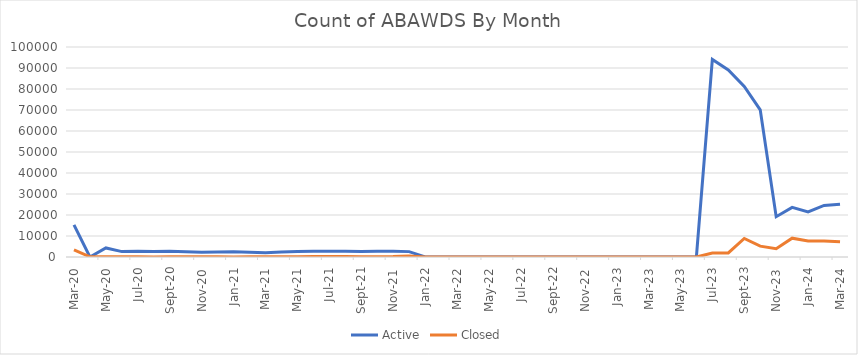
| Category | Active | Closed |
|---|---|---|
| 2024-03-24 | 25155 | 7256 |
| 2024-02-24 | 24536 | 7643 |
| 2024-01-24 | 21435 | 7584 |
| 2023-12-23 | 23650 | 8957 |
| 2023-11-23 | 19201 | 3967 |
| 2023-10-23 | 70071 | 5161 |
| 2023-09-23 | 81253 | 8837 |
| 2023-08-23 | 89107 | 1958 |
| 2023-07-23 | 94084 | 1891 |
| 2023-06-23 | 11 | 3 |
| 2023-05-23 | 0 | 0 |
| 2023-04-23 | 1 | 0 |
| 2023-03-23 | 1 | 0 |
| 2023-02-01 | 0 | 0 |
| 2023-01-01 | 0 | 0 |
| 2022-12-22 | 0 | 0 |
| 2022-11-22 | 4 | 2 |
| 2022-10-22 | 9 | 4 |
| 2022-09-22 | 14 | 5 |
| 2022-08-22 | 23 | 5 |
| 2022-07-22 | 21 | 8 |
| 2022-06-22 | 15 | 1 |
| 2022-05-22 | 9 | 0 |
| 2022-04-22 | 3 | 1 |
| 2022-03-22 | 1 | 0 |
| 2022-02-22 | 5 | 0 |
| 2022-01-22 | 0 | 0 |
| 2021-12-21 | 2561 | 469 |
| 2021-11-21 | 2701 | 189 |
| 2021-10-21 | 2734 | 176 |
| 2021-09-21 | 2576 | 164 |
| 2021-08-21 | 2693 | 243 |
| 2021-07-21 | 2696 | 236 |
| 2021-06-21 | 2738 | 188 |
| 2021-05-21 | 2579 | 124 |
| 2021-04-21 | 2342 | 104 |
| 2021-03-21 | 2083 | 91 |
| 2021-02-21 | 2214 | 79 |
| 2021-01-21 | 2509 | 20 |
| 2020-12-20 | 2330 | 132 |
| 2020-11-20 | 2253 | 99 |
| 2020-10-20 | 2455 | 107 |
| 2020-09-20 | 2775 | 113 |
| 2020-08-20 | 2638 | 42 |
| 2020-07-20 | 2724 | 114 |
| 2020-06-20 | 2565 | 65 |
| 2020-05-20 | 4314 | 139 |
| 2020-04-20 | 0 | 101 |
| 2020-03-20 | 15300 | 3394 |